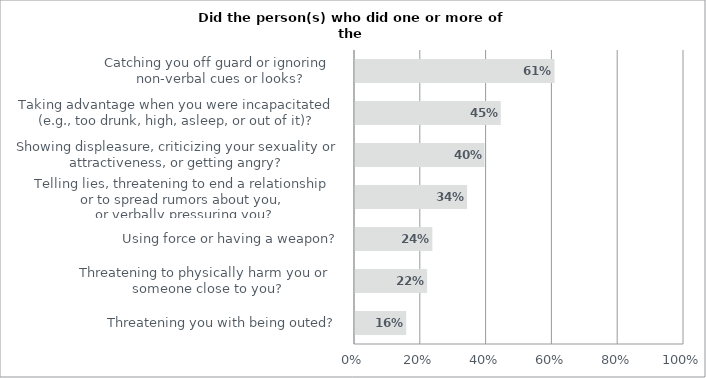
| Category | Yes |
|---|---|
| Threatening you with being outed? | 0.159 |
| Threatening to physically harm you or 
someone close to you? | 0.222 |
| Using force or having a weapon? | 0.238 |
| Telling lies, threatening to end a relationship 
or to spread rumors about you, 
or verbally pressuring you? | 0.344 |
| Showing displeasure, criticizing your sexuality or attractiveness, or getting angry? | 0.397 |
| Taking advantage when you were incapacitated
 (e.g., too drunk, high, asleep, or out of it)? | 0.446 |
| Catching you off guard or ignoring 
non-verbal cues or looks? | 0.609 |